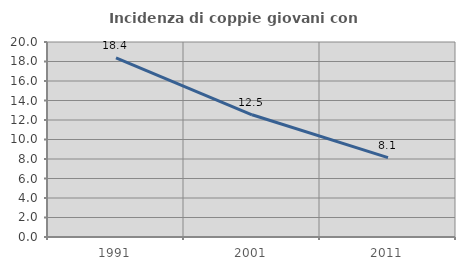
| Category | Incidenza di coppie giovani con figli |
|---|---|
| 1991.0 | 18.376 |
| 2001.0 | 12.534 |
| 2011.0 | 8.138 |